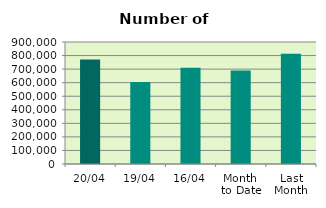
| Category | Series 0 |
|---|---|
| 20/04 | 770672 |
| 19/04 | 604382 |
| 16/04 | 709722 |
| Month 
to Date | 689430.833 |
| Last
Month | 813408 |